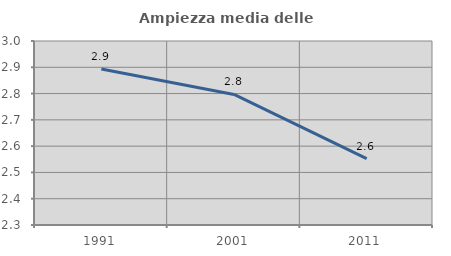
| Category | Ampiezza media delle famiglie |
|---|---|
| 1991.0 | 2.893 |
| 2001.0 | 2.797 |
| 2011.0 | 2.552 |